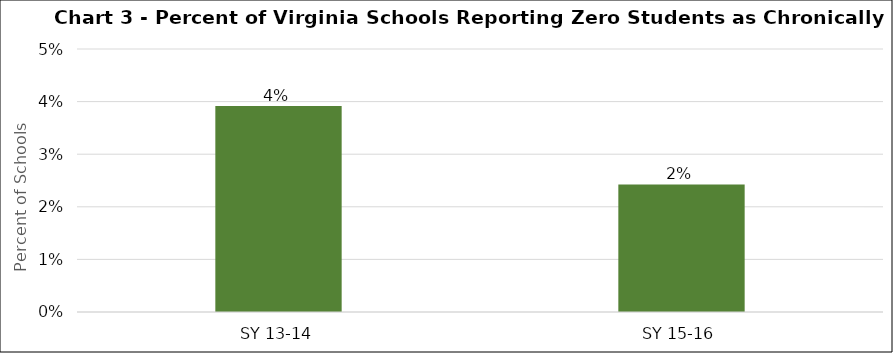
| Category | Series 0 |
|---|---|
| SY 13-14 | 0.039 |
| SY 15-16 | 0.024 |